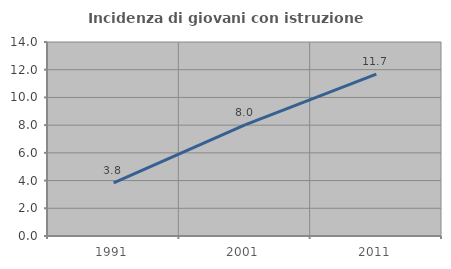
| Category | Incidenza di giovani con istruzione universitaria |
|---|---|
| 1991.0 | 3.829 |
| 2001.0 | 8.022 |
| 2011.0 | 11.683 |